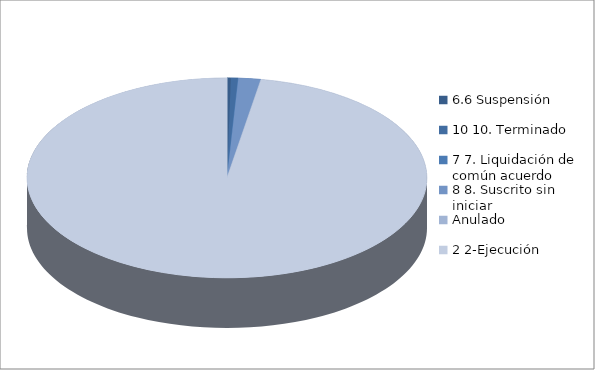
| Category | Series 0 |
|---|---|
| 6.6 Suspensión | 1 |
| 10 10. Terminado | 2 |
| 7 7. Liquidación de común acuerdo | 0 |
| 8 8. Suscrito sin iniciar | 6 |
| Anulado | 0 |
| 2 2-Ejecución | 322 |